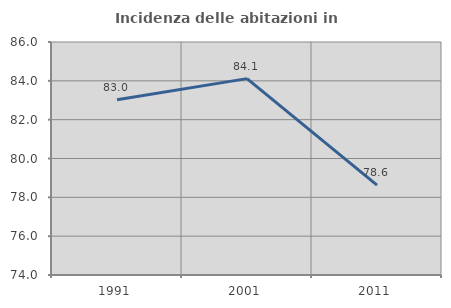
| Category | Incidenza delle abitazioni in proprietà  |
|---|---|
| 1991.0 | 83.026 |
| 2001.0 | 84.113 |
| 2011.0 | 78.626 |